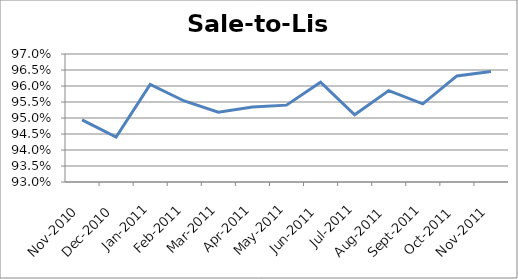
| Category | Series 0 |
|---|---|
| 2010-11-01 | 0.949 |
| 2010-12-01 | 0.944 |
| 2011-01-01 | 0.961 |
| 2011-02-01 | 0.955 |
| 2011-03-01 | 0.952 |
| 2011-04-01 | 0.953 |
| 2011-05-01 | 0.954 |
| 2011-06-01 | 0.961 |
| 2011-07-01 | 0.951 |
| 2011-08-01 | 0.959 |
| 2011-09-01 | 0.954 |
| 2011-10-01 | 0.963 |
| 2011-11-01 | 0.965 |